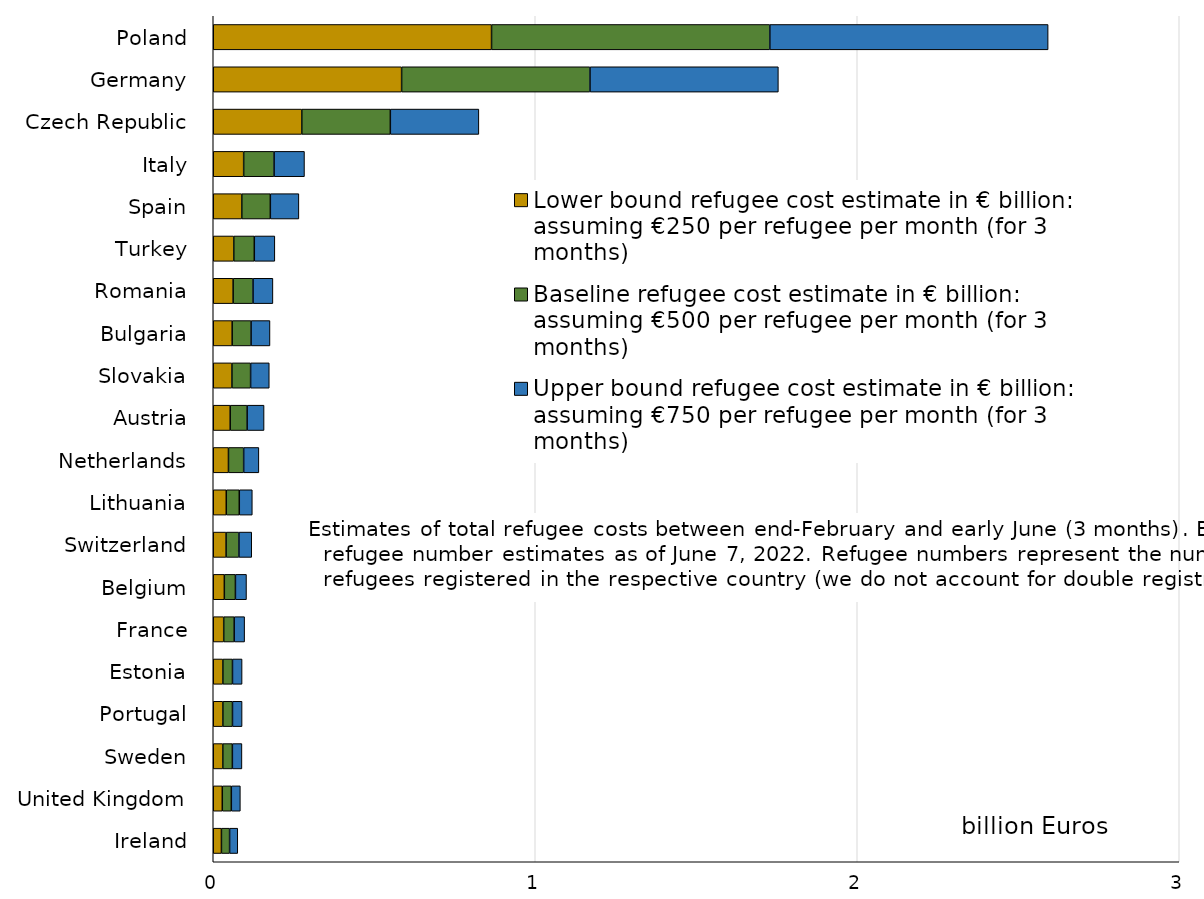
| Category | Lower bound refugee cost estimate in € billion: assuming €250 per refugee per month (for 3 months) | Baseline refugee cost estimate in € billion: assuming €500 per refugee per month (for 3 months) | Upper bound refugee cost estimate in € billion: assuming €750 per refugee per month (for 3 months) |
|---|---|---|---|
| Poland | 0.864 | 0.864 | 0.864 |
| Germany | 0.585 | 0.585 | 0.585 |
| Czech Republic | 0.275 | 0.275 | 0.275 |
| Italy | 0.094 | 0.094 | 0.094 |
| Spain | 0.089 | 0.089 | 0.089 |
| Turkey | 0.064 | 0.064 | 0.064 |
| Romania | 0.062 | 0.062 | 0.062 |
| Bulgaria | 0.059 | 0.059 | 0.059 |
| Slovakia | 0.058 | 0.058 | 0.058 |
| Austria | 0.053 | 0.053 | 0.053 |
| Netherlands | 0.047 | 0.047 | 0.047 |
| Lithuania | 0.04 | 0.04 | 0.04 |
| Switzerland | 0.04 | 0.04 | 0.04 |
| Belgium | 0.034 | 0.034 | 0.034 |
| France | 0.032 | 0.032 | 0.032 |
| Estonia | 0.03 | 0.03 | 0.03 |
| Portugal | 0.03 | 0.03 | 0.03 |
| Sweden | 0.03 | 0.03 | 0.03 |
| United Kingdom | 0.028 | 0.028 | 0.028 |
| Ireland | 0.025 | 0.025 | 0.025 |